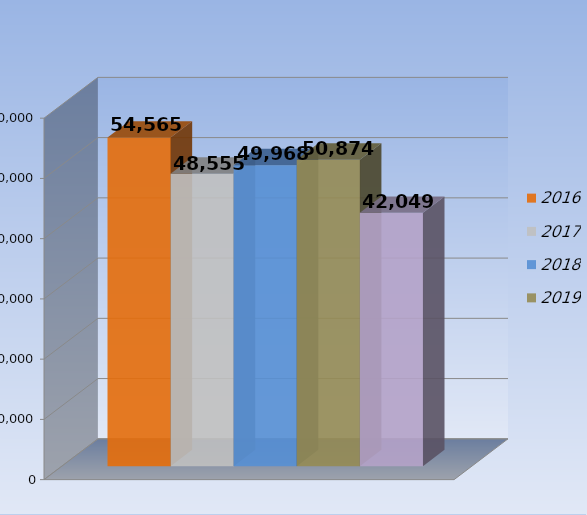
| Category | 2016 | 2017 | 2018 | 2019 | 2020 |
|---|---|---|---|---|---|
| 0 | 54565 | 48555 | 49968 | 50874 | 42049 |